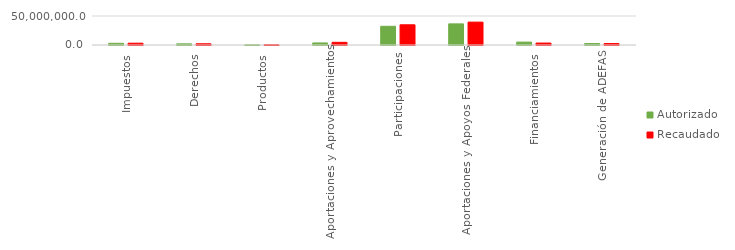
| Category | Autorizado | Recaudado |
|---|---|---|
| Impuestos | 2916029 | 3117477.5 |
| Derechos | 1970254 | 2080990.8 |
| Productos | 236336 | 384995.1 |
| Aportaciones y Aprovechamientos | 3523684 | 4613953.5 |
| Participaciones | 32254050 | 34846855.3 |
| Aportaciones y Apoyos Federales | 36408417.5 | 39447973.8 |
| Financiamientos | 5000000 | 3354187.2 |
| Generación de ADEFAS | 2467796 | 2462560 |